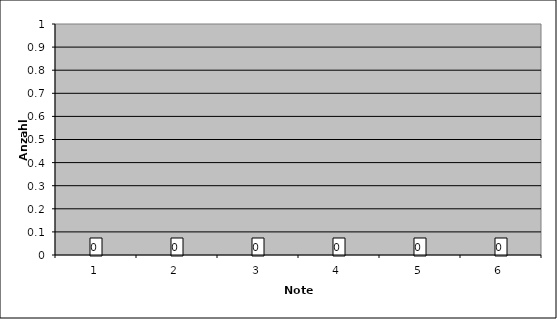
| Category | Anzahl: |
|---|---|
| 1.0 | 0 |
| 2.0 | 0 |
| 3.0 | 0 |
| 4.0 | 0 |
| 5.0 | 0 |
| 6.0 | 0 |